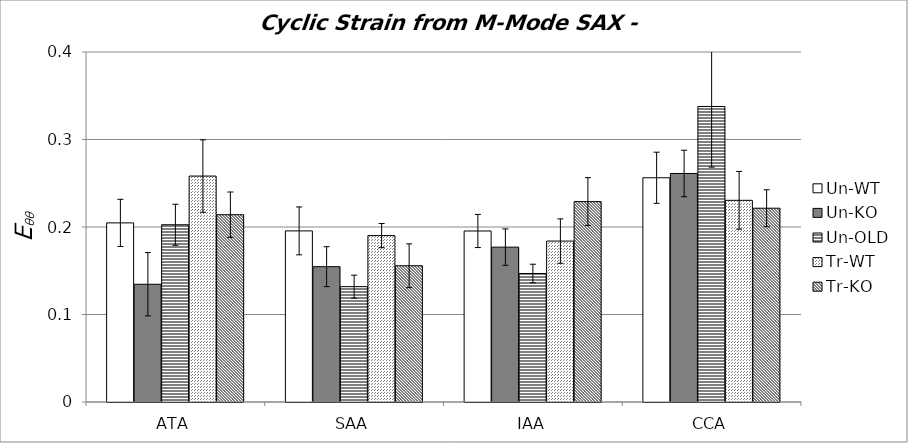
| Category | Un-WT | Un-KO | Un-OLD | Tr-WT | Tr-KO |
|---|---|---|---|---|---|
| 0 | 0.205 | 0.135 | 0.203 | 0.258 | 0.214 |
| 1 | 0.196 | 0.155 | 0.132 | 0.19 | 0.156 |
| 2 | 0.195 | 0.177 | 0.147 | 0.184 | 0.229 |
| 3 | 0.256 | 0.261 | 0.338 | 0.23 | 0.221 |